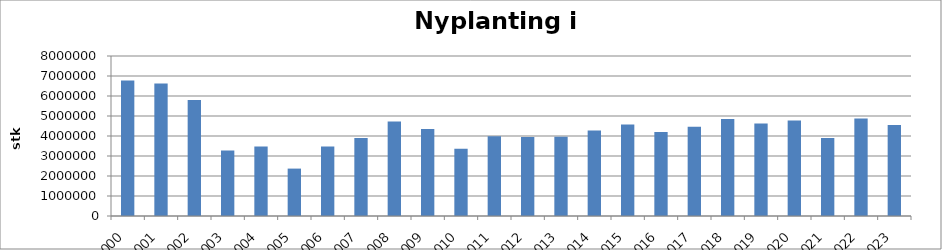
| Category | Totalt |
|---|---|
| 2000 | 6776969 |
| 2001 | 6622134 |
| 2002 | 5801712 |
| 2003 | 3271556 |
| 2004 | 3469386 |
| 2005 | 2370166 |
| 2006 | 3473699 |
| 2007 | 3902957 |
| 2008 | 4727511 |
| 2009 | 4345382 |
| 2010 | 3362757 |
| 2011 | 3984574 |
| 2012 | 3946714 |
| 2013 | 3968517 |
| 2014 | 4270889 |
| 2015 | 4574547 |
| 2016 | 4200212 |
| 2017 | 4468082 |
| 2018 | 4854955 |
| 2019 | 4623285 |
| 2020 | 4770709 |
| 2021 | 3901331 |
| 2022 | 4880230 |
| 2023 | 4552476 |